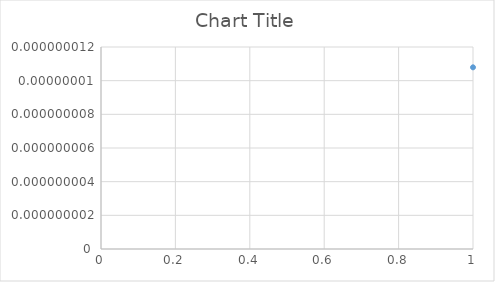
| Category | Series 0 |
|---|---|
| 0 | 0 |
| 1 | 0 |
| 2 | 0 |
| 3 | 0 |
| 4 | 0 |
| 5 | 0 |
| 6 | 0 |
| 7 | 0 |
| 8 | 0 |
| 9 | 0 |
| 10 | 0 |
| 11 | 0 |
| 12 | 0 |
| 13 | 0 |
| 14 | 0 |
| 15 | 0 |
| 16 | 0 |
| 17 | 0 |
| 18 | 0 |
| 19 | 0 |
| 20 | 0 |
| 21 | 0 |
| 22 | 0 |
| 23 | 0 |
| 24 | 0 |
| 25 | 0 |
| 26 | 0 |
| 27 | 0 |
| 28 | 0 |
| 29 | 0 |
| 30 | 0 |
| 31 | 0 |
| 32 | 0 |
| 33 | 0 |
| 34 | 0 |
| 35 | 0 |
| 36 | 0 |